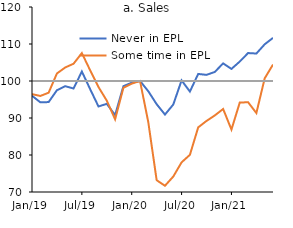
| Category | Never in EPL | Some time in EPL | Series 2 |
|---|---|---|---|
| 2019-01-01 | 96.021 | 96.456 | 100 |
| 2019-02-01 | 94.238 | 95.956 | 100 |
| 2019-03-01 | 94.302 | 96.838 | 100 |
| 2019-04-01 | 97.509 | 102.035 | 100 |
| 2019-05-01 | 98.599 | 103.659 | 100 |
| 2019-06-01 | 97.97 | 104.67 | 100 |
| 2019-07-01 | 102.557 | 107.543 | 100 |
| 2019-08-01 | 97.783 | 102.886 | 100 |
| 2019-09-01 | 93.118 | 98.372 | 100 |
| 2019-10-01 | 93.828 | 94.683 | 100 |
| 2019-11-01 | 90.784 | 89.648 | 100 |
| 2019-12-01 | 98.603 | 98.179 | 100 |
| 2020-01-01 | 99.541 | 99.292 | 100 |
| 2020-02-01 | 100 | 100 | 100 |
| 2020-03-01 | 97.211 | 88.771 | 100 |
| 2020-04-01 | 93.731 | 73.194 | 100 |
| 2020-05-01 | 90.928 | 71.683 | 100 |
| 2020-06-01 | 93.645 | 74.179 | 100 |
| 2020-07-01 | 100.167 | 78.017 | 100 |
| 2020-08-01 | 97.148 | 80.045 | 100 |
| 2020-09-01 | 101.91 | 87.471 | 100 |
| 2020-10-01 | 101.658 | 89.211 | 100 |
| 2020-11-01 | 102.453 | 90.706 | 100 |
| 2020-12-01 | 104.77 | 92.434 | 100 |
| 2021-01-01 | 103.268 | 86.873 | 100 |
| 2021-02-01 | 105.251 | 94.168 | 100 |
| 2021-03-01 | 107.554 | 94.266 | 100 |
| 2021-04-01 | 107.423 | 91.344 | 100 |
| 2021-05-01 | 109.915 | 100.712 | 100 |
| 2021-06-01 | 111.659 | 104.448 | 100 |